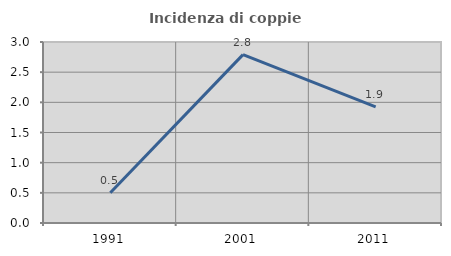
| Category | Incidenza di coppie miste |
|---|---|
| 1991.0 | 0.5 |
| 2001.0 | 2.791 |
| 2011.0 | 1.923 |